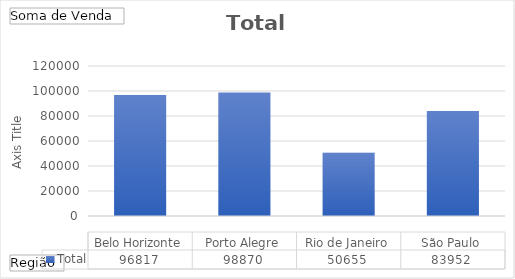
| Category | Total |
|---|---|
| Belo Horizonte | 96817 |
| Porto Alegre | 98870 |
| Rio de Janeiro | 50655 |
| São Paulo | 83952 |